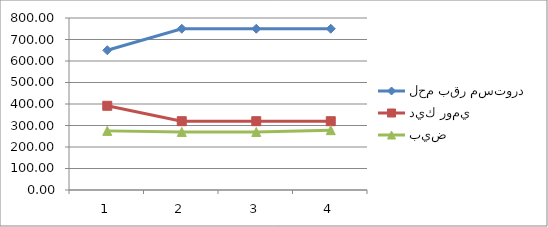
| Category | لحم بقر مستورد | ديك رومي | بيض |
|---|---|---|---|
| 0 | 650 | 391.67 | 275 |
| 1 | 750 | 320 | 270 |
| 2 | 750 | 320 | 270 |
| 3 | 750 | 320 | 278.33 |